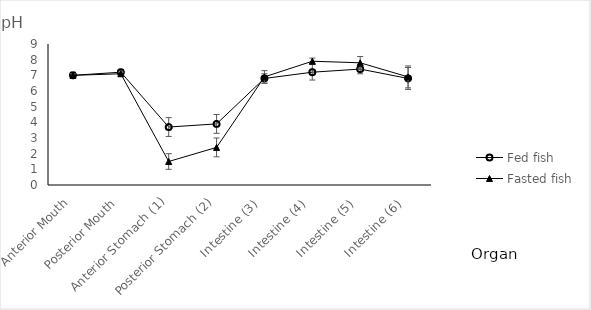
| Category | Fed fish | Fasted fish |
|---|---|---|
| Anterior Mouth | 7 | 7 |
| Posterior Mouth | 7.2 | 7.1 |
| Anterior Stomach (1) | 3.7 | 1.5 |
| Posterior Stomach (2) | 3.9 | 2.4 |
| Intestine (3)  | 6.8 | 6.9 |
| Intestine (4)  | 7.2 | 7.9 |
| Intestine (5)  | 7.4 | 7.8 |
| Intestine (6)  | 6.8 | 6.9 |